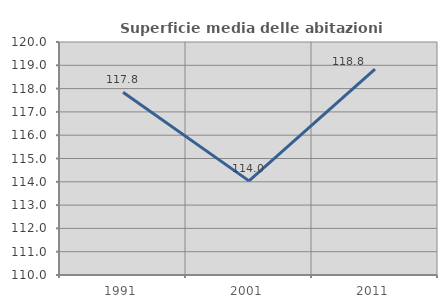
| Category | Superficie media delle abitazioni occupate |
|---|---|
| 1991.0 | 117.845 |
| 2001.0 | 114.04 |
| 2011.0 | 118.831 |